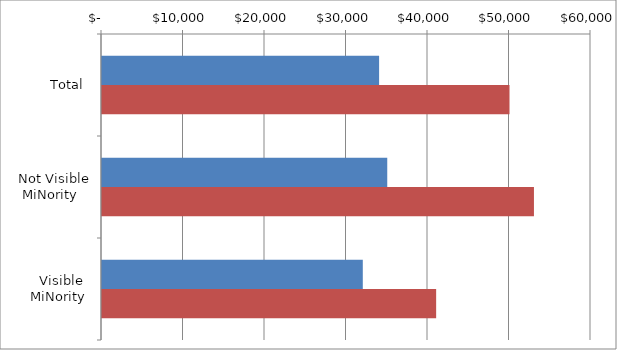
| Category | Series 0 | Series 1 |
|---|---|---|
| Total | 34000 | 50000 |
|  Not Visible MiNority  | 35000 | 53000 |
|  Visible MiNority  | 32000 | 41000 |